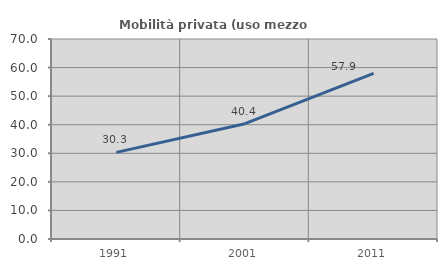
| Category | Mobilità privata (uso mezzo privato) |
|---|---|
| 1991.0 | 30.326 |
| 2001.0 | 40.367 |
| 2011.0 | 57.933 |